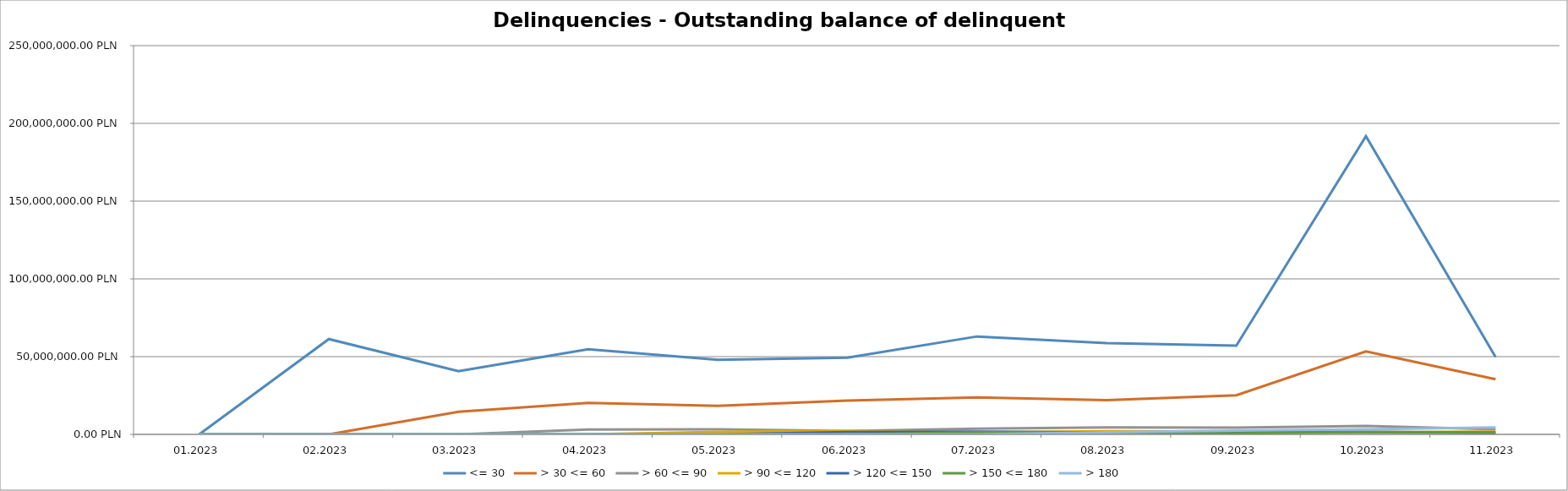
| Category | <= 30 | > 30 <= 60 | > 60 <= 90 | > 90 <= 120 | > 120 <= 150 | > 150 <= 180 | > 180 |
|---|---|---|---|---|---|---|---|
| 01.2023 | 0 | 0 | 0 | 0 | 0 | 0 | 0 |
| 02.2023 | 61279332.52 | 0 | 0 | 0 | 0 | 0 | 0 |
| 03.2023 | 40663789.15 | 14592814.21 | 0 | 0 | 0 | 0 | 0 |
| 04.2023 | 54729258.98 | 20207986.71 | 3105470.81 | 0 | 0 | 0 | 0 |
| 05.2023 | 47980491.52 | 18365026.23 | 3236930.39 | 1575049.71 | 0 | 0 | 0 |
| 06.2023 | 49274463.43 | 21757116.33 | 2145346.9 | 2234258.08 | 1546159.58 | 0 | 0 |
| 07.2023 | 62971390.96 | 23765504.45 | 3638339.96 | 1315739.52 | 1741228.92 | 1367122.32 | 0 |
| 08.2023 | 58667444.31 | 21958530.42 | 4534282.61 | 1998402.31 | 1197894.69 | 1186456.03 | 1367122.32 |
| 09.2023 | 57013090.09 | 25164417.49 | 4339269.75 | 1883194.82 | 1723494.5 | 705526.9 | 2508053.04 |
| 10.2023 | 191776280.48 | 53378945.55 | 5393392.38 | 1354505.77 | 1667300.89 | 1446484.43 | 3213579.94 |
| 11.2023 | 49723312.18 | 35482092.6 | 3276474.02 | 1813628.1 | 960023.75 | 1340003.09 | 4479480.65 |